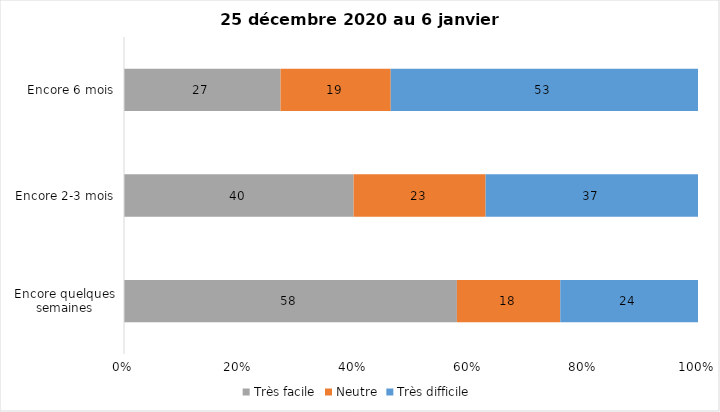
| Category | Très facile | Neutre | Très difficile |
|---|---|---|---|
| Encore quelques semaines | 58 | 18 | 24 |
| Encore 2-3 mois | 40 | 23 | 37 |
| Encore 6 mois | 27 | 19 | 53 |